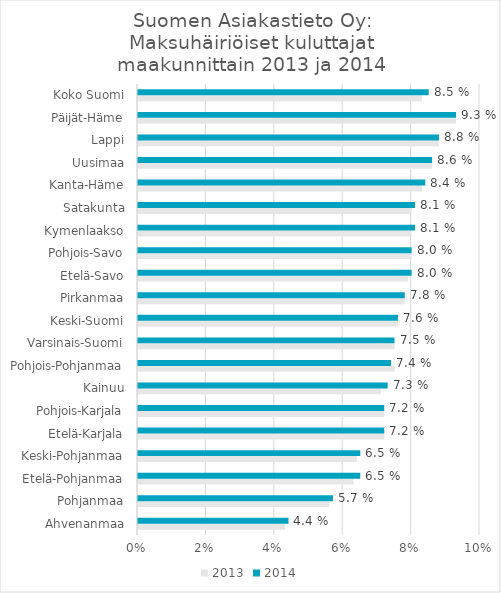
| Category | 2013 | 2014 |
|---|---|---|
| Ahvenanmaa | 0.043 | 0.044 |
| Pohjanmaa | 0.056 | 0.057 |
| Etelä-Pohjanmaa | 0.063 | 0.065 |
| Keski-Pohjanmaa | 0.064 | 0.065 |
| Etelä-Karjala | 0.072 | 0.072 |
| Pohjois-Karjala | 0.072 | 0.072 |
| Kainuu | 0.071 | 0.073 |
| Pohjois-Pohjanmaa | 0.075 | 0.074 |
| Varsinais-Suomi | 0.075 | 0.075 |
| Keski-Suomi | 0.076 | 0.076 |
| Pirkanmaa | 0.078 | 0.078 |
| Etelä-Savo | 0.079 | 0.08 |
| Pohjois-Savo | 0.08 | 0.08 |
| Kymenlaakso | 0.08 | 0.081 |
| Satakunta | 0.08 | 0.081 |
| Kanta-Häme | 0.083 | 0.084 |
| Uusimaa | 0.086 | 0.086 |
| Lappi | 0.088 | 0.088 |
| Päijät-Häme | 0.093 | 0.093 |
| Koko Suomi | 0.083 | 0.085 |